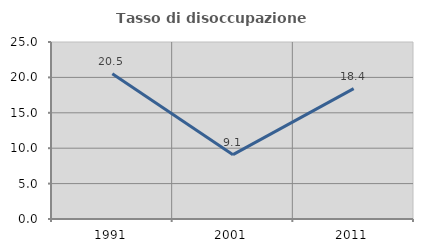
| Category | Tasso di disoccupazione giovanile  |
|---|---|
| 1991.0 | 20.513 |
| 2001.0 | 9.091 |
| 2011.0 | 18.421 |